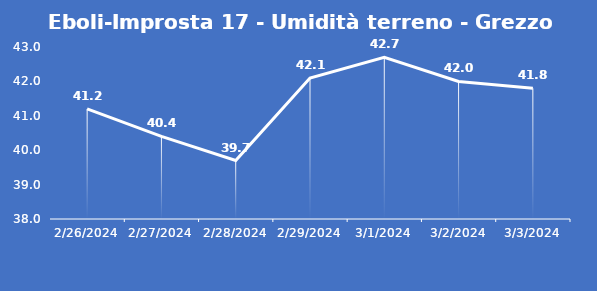
| Category | Eboli-Improsta 17 - Umidità terreno - Grezzo (%VWC) |
|---|---|
| 2/26/24 | 41.2 |
| 2/27/24 | 40.4 |
| 2/28/24 | 39.7 |
| 2/29/24 | 42.1 |
| 3/1/24 | 42.7 |
| 3/2/24 | 42 |
| 3/3/24 | 41.8 |